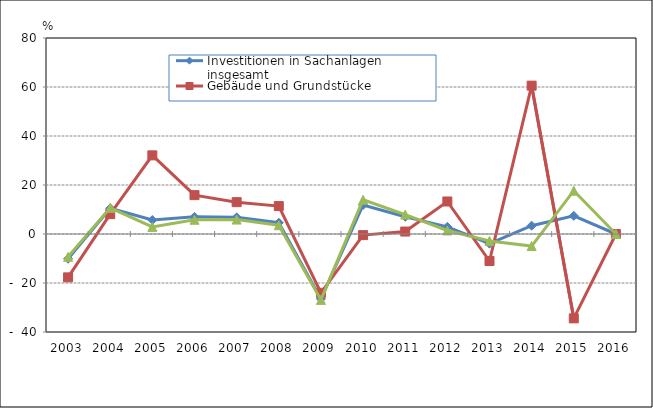
| Category | Investitionen in Sachanlagen insgesamt | Gebäude und Grundstücke | Maschinen und Betriebsausstattung |
|---|---|---|---|
| 2003.0 | -10.1 | -17.7 | -9.3 |
| 2004.0 | 10.5 | 8.1 | 10.7 |
| 2005.0 | 5.7 | 32.1 | 2.9 |
| 2006.0 | 6.991 | 15.857 | 5.812 |
| 2007.0 | 6.796 | 13.004 | 5.891 |
| 2008.0 | 4.6 | 11.4 | 3.579 |
| 2009.0 | -26.476 | -23.99 | -26.892 |
| 2010.0 | 11.843 | -0.455 | 13.982 |
| 2011.0 | 7.019 | 1.003 | 7.933 |
| 2012.0 | 2.918 | 13.273 | 1.446 |
| 2013.0 | -3.946 | -11.028 | -2.822 |
| 2014.0 | 3.39 | 60.554 | -4.916 |
| 2015.0 | 7.413 | -34.433 | 17.68 |
| 2016.0 | 0 | 0 | 0 |